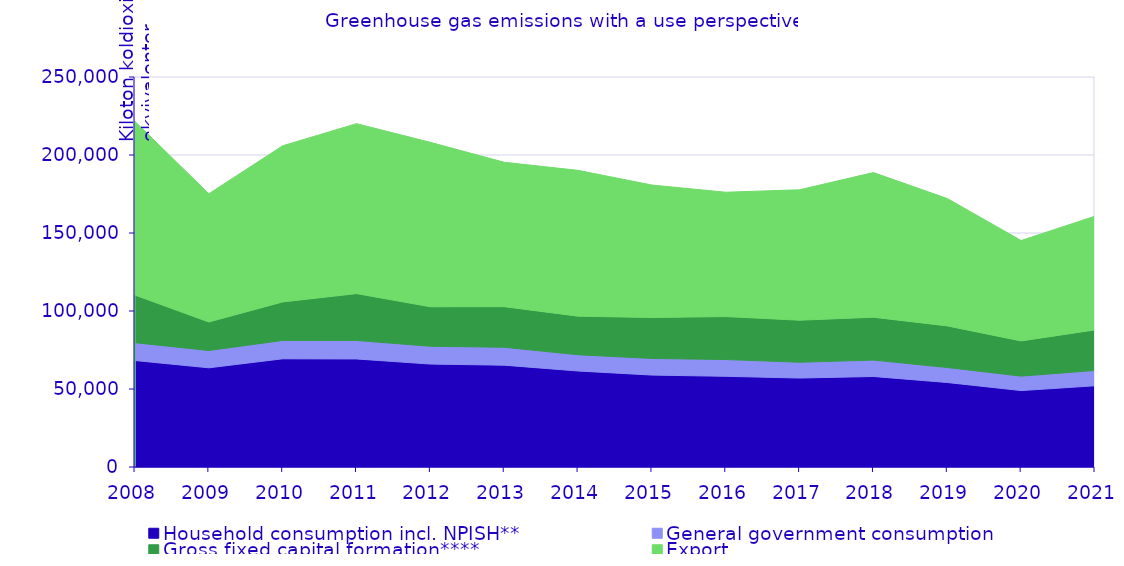
| Category | Household consumption incl. NPISH** | General government consumption | Gross fixed capital formation**** | Export |
|---|---|---|---|---|
| 2008.0 | 68254.175 | 11420.005 | 30510.038 | 111358.385 |
| 2009.0 | 63580.285 | 11094.035 | 18272.982 | 82204.734 |
| 2010.0 | 69359.96 | 11769.559 | 24693.731 | 100094.575 |
| 2011.0 | 69268.454 | 11837.572 | 30036.097 | 108953.392 |
| 2012.0 | 65977.651 | 11417.841 | 25320.17 | 105381.445 |
| 2013.0 | 65276.866 | 11474.72 | 26037.875 | 92562.114 |
| 2014.0 | 61540.033 | 10405.401 | 24747.847 | 93458.786 |
| 2015.0 | 58932.844 | 10643.783 | 26256.03 | 84900.017 |
| 2016.0 | 58140.044 | 10746.49 | 27544.695 | 79712.403 |
| 2017.0 | 57017.663 | 10127.729 | 26967.552 | 83595.089 |
| 2018.0 | 58013.632 | 10498.266 | 27484.875 | 92749.051 |
| 2019.0 | 54160.855 | 9616.703 | 26671.748 | 81638.098 |
| 2020.0 | 48987.976 | 9259.65 | 22565.244 | 64365.32 |
| 2021.0 | 52064.529 | 9822.15 | 25993.151 | 72908.953 |